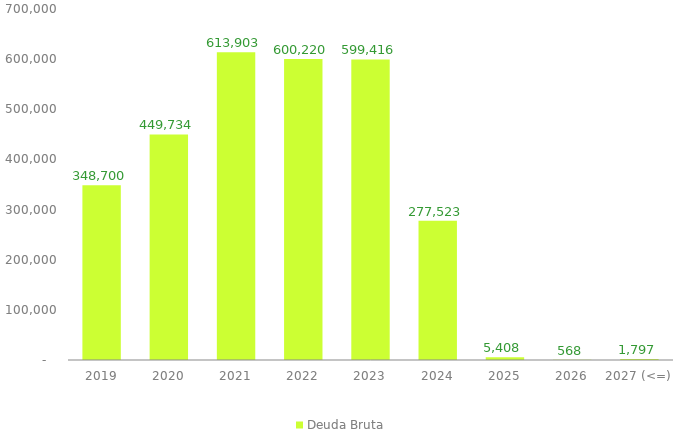
| Category | Deuda Bruta |
|---|---|
| 2019 | 348699.609 |
| 2020 | 449733.819 |
| 2021 | 613902.741 |
| 2022 | 600220.201 |
| 2023 | 599415.978 |
| 2024 | 277523.459 |
| 2025 | 5407.91 |
| 2026 | 567.533 |
| 2027 (<=) | 1797.188 |